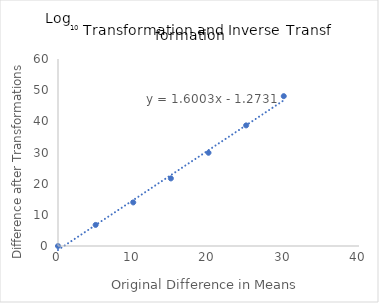
| Category | 0.000 |
|---|---|
| 0.0 | 0 |
| 5.0 | 6.762 |
| 10.0 | 13.981 |
| 15.0 | 21.687 |
| 20.0 | 29.916 |
| 25.0 | 38.7 |
| 30.0 | 48.078 |